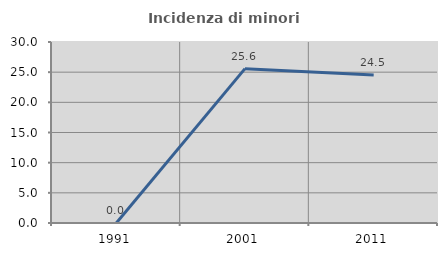
| Category | Incidenza di minori stranieri |
|---|---|
| 1991.0 | 0 |
| 2001.0 | 25.581 |
| 2011.0 | 24.528 |